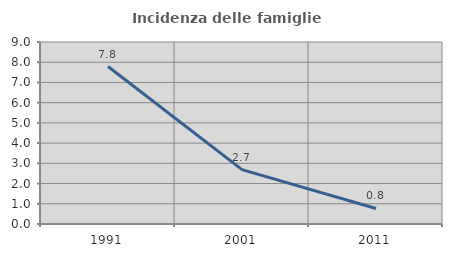
| Category | Incidenza delle famiglie numerose |
|---|---|
| 1991.0 | 7.786 |
| 2001.0 | 2.686 |
| 2011.0 | 0.768 |